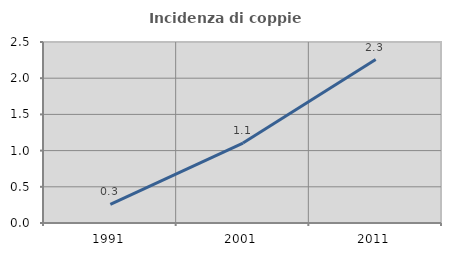
| Category | Incidenza di coppie miste |
|---|---|
| 1991.0 | 0.257 |
| 2001.0 | 1.104 |
| 2011.0 | 2.257 |